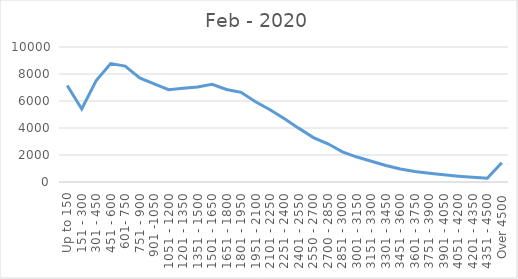
| Category | Feb - 2020 |
|---|---|
| Up to 150 | 7153 |
| 151 - 300 | 5408 |
| 301 - 450 | 7512 |
| 451 - 600 | 8773 |
| 601- 750 | 8586 |
| 751 - 900 | 7703 |
| 901 -1050 | 7263 |
| 1051 - 1200 | 6843 |
| 1201 - 1350 | 6941 |
| 1351 - 1500 | 7043 |
| 1501 - 1650 | 7236 |
| 1651 - 1800 | 6853 |
| 1801 - 1950 | 6642 |
| 1951 - 2100 | 5942 |
| 2101 - 2250 | 5351 |
| 2251 - 2400 | 4686 |
| 2401 - 2550 | 3972 |
| 2550 - 2700 | 3292 |
| 2700 - 2850 | 2833 |
| 2851 - 3000 | 2237 |
| 3001 - 3150 | 1848 |
| 3151 - 3300 | 1538 |
| 3301 - 3450 | 1225 |
| 3451 - 3600 | 960 |
| 3601 - 3750 | 778 |
| 3751 - 3900 | 647 |
| 3901 - 4050 | 532 |
| 4051 - 4200 | 428 |
| 4201 - 4350 | 347 |
| 4351 - 4500 | 281 |
| Over 4500 | 1420 |